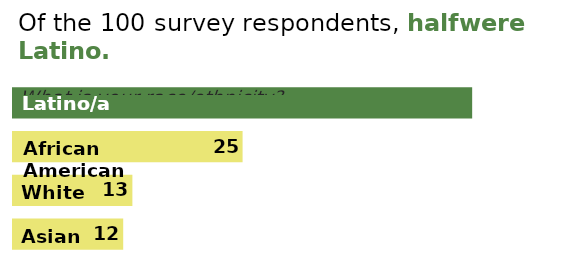
| Category | Series 0 |
|---|---|
| Asian | 12 |
| White | 13 |
| African American | 25 |
| Latino/a | 50 |